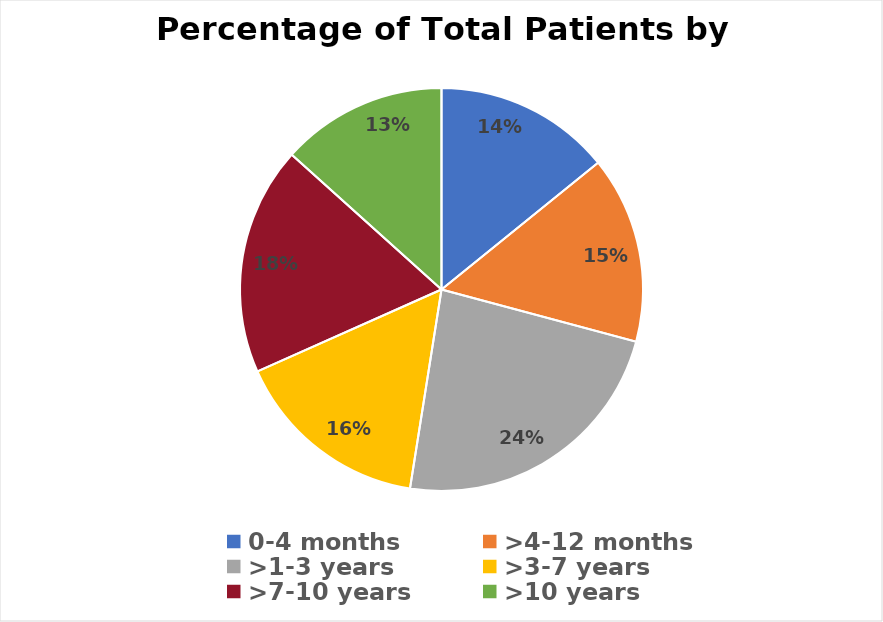
| Category | Series 0 |
|---|---|
| 0-4 months | 17 |
| >4-12 months | 18 |
| >1-3 years | 28 |
| >3-7 years | 19 |
| >7-10 years | 22 |
| >10 years | 16 |